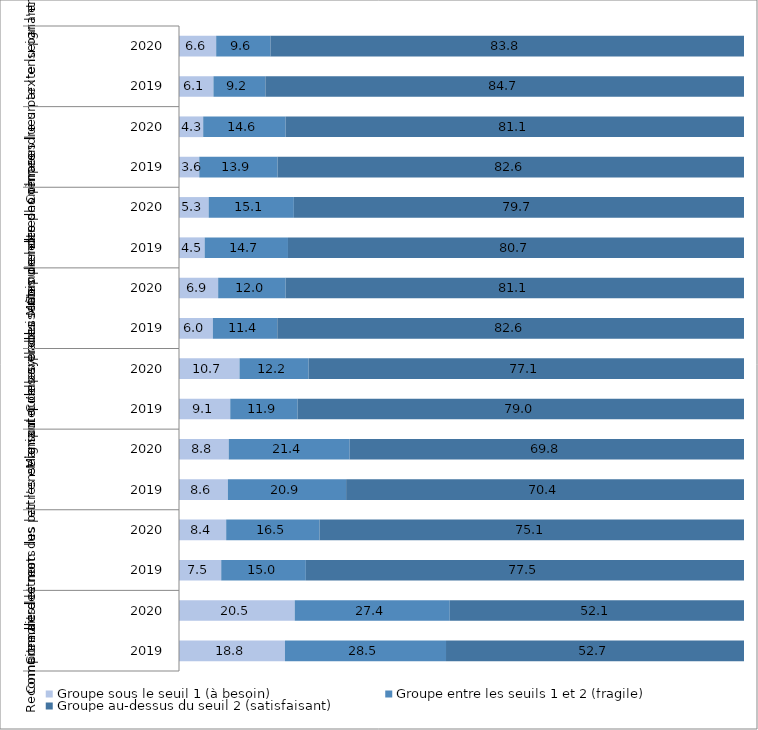
| Category | Groupe sous le seuil 1 (à besoin) | Groupe entre les seuils 1 et 2 (fragile) | Groupe au-dessus du seuil 2 (satisfaisant) |
|---|---|---|---|
| 0 | 18.752 | 28.508 | 52.741 |
| 1 | 20.48 | 27.44 | 52.07 |
| 2 | 7.473 | 14.978 | 77.549 |
| 3 | 8.35 | 16.53 | 75.11 |
| 4 | 8.65 | 20.93 | 70.42 |
| 5 | 8.8 | 21.41 | 69.79 |
| 6 | 9.07 | 11.936 | 78.994 |
| 7 | 10.71 | 12.24 | 77.05 |
| 8 | 5.992 | 11.404 | 82.604 |
| 9 | 6.93 | 11.95 | 81.12 |
| 10 | 4.542 | 14.746 | 80.712 |
| 11 | 5.25 | 15.08 | 79.67 |
| 12 | 3.588 | 13.862 | 82.551 |
| 13 | 4.28 | 14.59 | 81.12 |
| 14 | 6.096 | 9.191 | 84.713 |
| 15 | 6.58 | 9.6 | 83.82 |